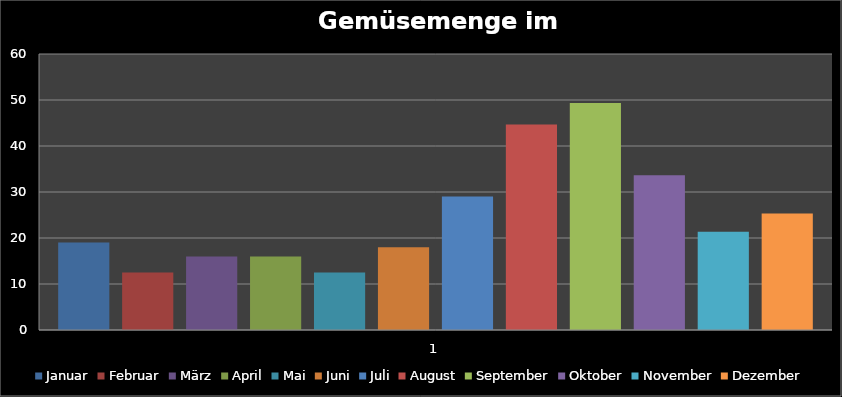
| Category | Januar | Februar | März | April | Mai | Juni | Juli | August | September | Oktober | November | Dezember |
|---|---|---|---|---|---|---|---|---|---|---|---|---|
| 0 | 19 | 12.5 | 16 | 16 | 12.5 | 18 | 29 | 44.667 | 49.333 | 33.667 | 21.333 | 25.333 |